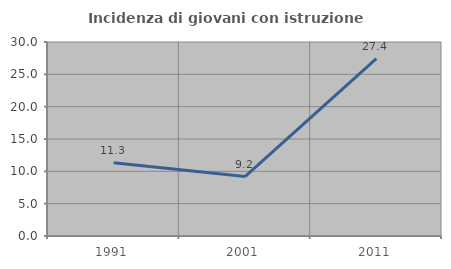
| Category | Incidenza di giovani con istruzione universitaria |
|---|---|
| 1991.0 | 11.321 |
| 2001.0 | 9.184 |
| 2011.0 | 27.419 |